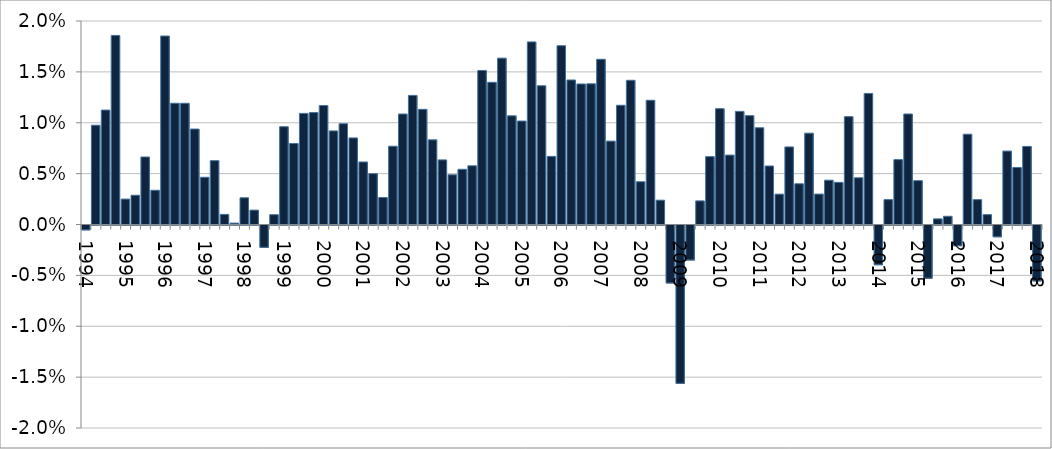
| Category | Quarterly change |
|---|---|
| 1994.0 | 0 |
| nan | 0.01 |
| nan | 0.011 |
| nan | 0.019 |
| 1995.0 | 0.002 |
| nan | 0.003 |
| nan | 0.007 |
| nan | 0.003 |
| 1996.0 | 0.019 |
| nan | 0.012 |
| nan | 0.012 |
| nan | 0.009 |
| 1997.0 | 0.005 |
| nan | 0.006 |
| nan | 0.001 |
| nan | 0 |
| 1998.0 | 0.003 |
| nan | 0.001 |
| nan | -0.002 |
| nan | 0.001 |
| 1999.0 | 0.01 |
| nan | 0.008 |
| nan | 0.011 |
| nan | 0.011 |
| 2000.0 | 0.012 |
| nan | 0.009 |
| nan | 0.01 |
| nan | 0.009 |
| 2001.0 | 0.006 |
| nan | 0.005 |
| nan | 0.003 |
| nan | 0.008 |
| 2002.0 | 0.011 |
| nan | 0.013 |
| nan | 0.011 |
| nan | 0.008 |
| 2003.0 | 0.006 |
| nan | 0.005 |
| nan | 0.005 |
| nan | 0.006 |
| 2004.0 | 0.015 |
| nan | 0.014 |
| nan | 0.016 |
| nan | 0.011 |
| 2005.0 | 0.01 |
| nan | 0.018 |
| nan | 0.014 |
| nan | 0.007 |
| 2006.0 | 0.018 |
| nan | 0.014 |
| nan | 0.014 |
| nan | 0.014 |
| 2007.0 | 0.016 |
| nan | 0.008 |
| nan | 0.012 |
| nan | 0.014 |
| 2008.0 | 0.004 |
| nan | 0.012 |
| nan | 0.002 |
| nan | -0.006 |
| 2009.0 | -0.016 |
| nan | -0.003 |
| nan | 0.002 |
| nan | 0.007 |
| 2010.0 | 0.011 |
| nan | 0.007 |
| nan | 0.011 |
| nan | 0.011 |
| 2011.0 | 0.01 |
| nan | 0.006 |
| nan | 0.003 |
| nan | 0.008 |
| 2012.0 | 0.004 |
| nan | 0.009 |
| nan | 0.003 |
| nan | 0.004 |
| 2013.0 | 0.004 |
| nan | 0.011 |
| nan | 0.005 |
| nan | 0.013 |
| 2014.0 | -0.004 |
| nan | 0.002 |
| nan | 0.006 |
| nan | 0.011 |
| 2015.0 | 0.004 |
| nan | -0.005 |
| nan | 0.001 |
| nan | 0.001 |
| 2016.0 | -0.002 |
| nan | 0.009 |
| nan | 0.002 |
| nan | 0.001 |
| 2017.0 | -0.001 |
| nan | 0.007 |
| nan | 0.006 |
| nan | 0.008 |
| 2018.0 | -0.005 |